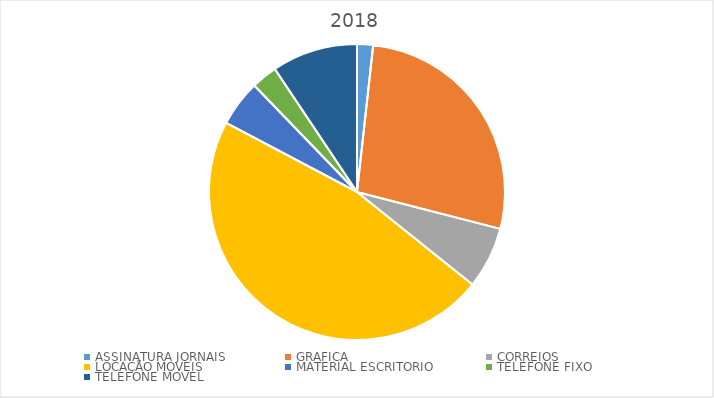
| Category | Series 0 |
|---|---|
| ASSINATURA JORNAIS | 929.8 |
| GRAFICA | 14487 |
| CORREIOS | 3587.13 |
| LOCAÇÃO MOVEIS | 24975 |
| MATERIAL ESCRITORIO | 2680.6 |
| TELEFONE FIXO | 1506.52 |
| TELEFONE MOVEL | 4981.9 |